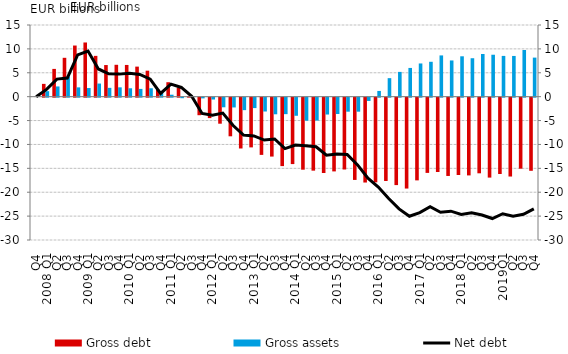
| Category | Gross debt | Gross assets |
|---|---|---|
| Q4 | 0 | 0 |
| 2008 Q1 | 2.678 | 1.155 |
| Q2 | 5.81 | 2.14 |
| Q3 | 8.134 | 4.229 |
| Q4 | 10.703 | 1.946 |
| 2009 Q1 | 11.342 | 1.807 |
| Q2 | 8.54 | 2.745 |
| Q3 | 6.618 | 1.846 |
| Q4 | 6.671 | 1.952 |
| 2010 Q1 | 6.639 | 1.755 |
| Q2 | 6.289 | 1.626 |
| Q3 | 5.439 | 1.76 |
| Q4 | 1.492 | 0.816 |
| 2011 Q1 | 3.024 | 0.408 |
| Q2 | 1.819 | -0.11 |
| Q3 | 0.155 | 0.068 |
| Q4 | -3.672 | -0.147 |
| 2012 Q1 | -4.278 | -0.388 |
| Q2 | -5.449 | -2.015 |
| Q3 | -8.086 | -2.048 |
| Q4 | -10.636 | -2.611 |
| 2013 Q1 | -10.407 | -2.179 |
| Q2 | -11.977 | -2.897 |
| Q3 | -12.329 | -3.478 |
| Q4 | -14.322 | -3.451 |
| 2014 Q1 | -13.901 | -3.791 |
| Q2 | -15.074 | -4.821 |
| Q3 | -15.274 | -4.798 |
| Q4 | -15.768 | -3.527 |
| 2015 Q1 | -15.435 | -3.419 |
| Q2 | -15.035 | -2.932 |
| Q3 | -17.217 | -2.932 |
| Q4 | -17.762 | -0.688 |
| 2016 Q1 | -17.718 | 1.198 |
| Q2 | -17.437 | 3.873 |
| Q3 | -18.299 | 5.184 |
| Q4 | -19.022 | 6.013 |
| 2017 Q1 | -17.312 | 6.95 |
| Q2 | -15.746 | 7.302 |
| Q3 | -15.563 | 8.633 |
| Q4 | -16.389 | 7.58 |
| 2018 Q1 | -16.188 | 8.451 |
| Q2 | -16.273 | 8.045 |
| Q3 | -15.833 | 8.935 |
| Q4 | -16.729 | 8.776 |
| 2019Q1 | -15.976 | 8.531 |
| Q2 | -16.505 | 8.522 |
| Q3 | -14.862 | 9.762 |
| Q4 | -15.307 | 8.175 |